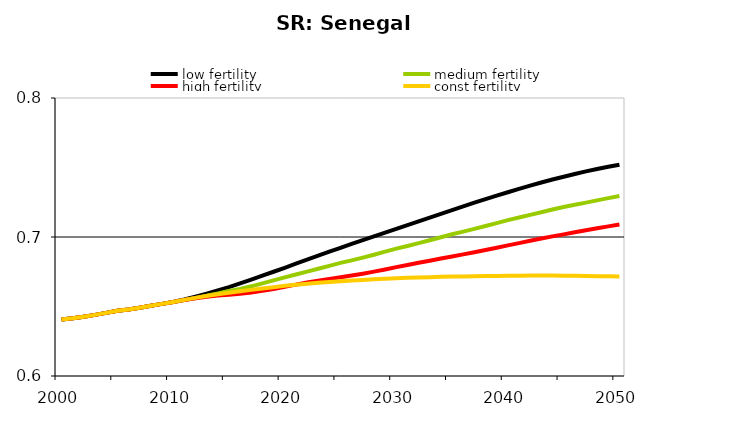
| Category | low fertility | medium fertility | high fertility | const fertility |
|---|---|---|---|---|
| 2000.0 | 0.591 | 0.591 | 0.591 | 0.591 |
| 2001.0 | 0.592 | 0.592 | 0.592 | 0.592 |
| 2002.0 | 0.593 | 0.593 | 0.593 | 0.593 |
| 2003.0 | 0.594 | 0.594 | 0.594 | 0.594 |
| 2004.0 | 0.595 | 0.595 | 0.595 | 0.595 |
| 2005.0 | 0.597 | 0.597 | 0.597 | 0.597 |
| 2006.0 | 0.598 | 0.598 | 0.598 | 0.598 |
| 2007.0 | 0.599 | 0.599 | 0.599 | 0.599 |
| 2008.0 | 0.6 | 0.6 | 0.6 | 0.6 |
| 2009.0 | 0.602 | 0.602 | 0.602 | 0.602 |
| 2010.0 | 0.603 | 0.603 | 0.603 | 0.603 |
| 2011.0 | 0.605 | 0.605 | 0.605 | 0.605 |
| 2012.0 | 0.607 | 0.606 | 0.606 | 0.606 |
| 2013.0 | 0.609 | 0.608 | 0.607 | 0.608 |
| 2014.0 | 0.612 | 0.609 | 0.608 | 0.609 |
| 2015.0 | 0.614 | 0.611 | 0.608 | 0.61 |
| 2016.0 | 0.617 | 0.613 | 0.609 | 0.611 |
| 2017.0 | 0.619 | 0.615 | 0.61 | 0.612 |
| 2018.0 | 0.622 | 0.617 | 0.611 | 0.613 |
| 2019.0 | 0.625 | 0.619 | 0.613 | 0.614 |
| 2020.0 | 0.628 | 0.621 | 0.614 | 0.615 |
| 2021.0 | 0.631 | 0.623 | 0.616 | 0.616 |
| 2022.0 | 0.634 | 0.625 | 0.617 | 0.616 |
| 2023.0 | 0.637 | 0.627 | 0.619 | 0.617 |
| 2024.0 | 0.639 | 0.629 | 0.62 | 0.618 |
| 2025.0 | 0.642 | 0.631 | 0.621 | 0.618 |
| 2026.0 | 0.645 | 0.633 | 0.622 | 0.619 |
| 2027.0 | 0.648 | 0.635 | 0.624 | 0.619 |
| 2028.0 | 0.65 | 0.637 | 0.625 | 0.62 |
| 2029.0 | 0.653 | 0.639 | 0.627 | 0.62 |
| 2030.0 | 0.656 | 0.642 | 0.628 | 0.62 |
| 2031.0 | 0.659 | 0.644 | 0.63 | 0.621 |
| 2032.0 | 0.661 | 0.646 | 0.631 | 0.621 |
| 2033.0 | 0.664 | 0.648 | 0.633 | 0.621 |
| 2034.0 | 0.667 | 0.65 | 0.634 | 0.621 |
| 2035.0 | 0.669 | 0.652 | 0.636 | 0.622 |
| 2036.0 | 0.672 | 0.654 | 0.637 | 0.622 |
| 2037.0 | 0.675 | 0.656 | 0.639 | 0.622 |
| 2038.0 | 0.677 | 0.658 | 0.641 | 0.622 |
| 2039.0 | 0.68 | 0.66 | 0.642 | 0.622 |
| 2040.0 | 0.682 | 0.662 | 0.644 | 0.622 |
| 2041.0 | 0.685 | 0.664 | 0.646 | 0.622 |
| 2042.0 | 0.687 | 0.666 | 0.647 | 0.622 |
| 2043.0 | 0.689 | 0.668 | 0.649 | 0.622 |
| 2044.0 | 0.691 | 0.67 | 0.65 | 0.622 |
| 2045.0 | 0.693 | 0.672 | 0.652 | 0.622 |
| 2046.0 | 0.695 | 0.673 | 0.653 | 0.622 |
| 2047.0 | 0.697 | 0.675 | 0.655 | 0.622 |
| 2048.0 | 0.699 | 0.676 | 0.656 | 0.622 |
| 2049.0 | 0.701 | 0.678 | 0.658 | 0.622 |
| 2050.0 | 0.702 | 0.68 | 0.659 | 0.622 |